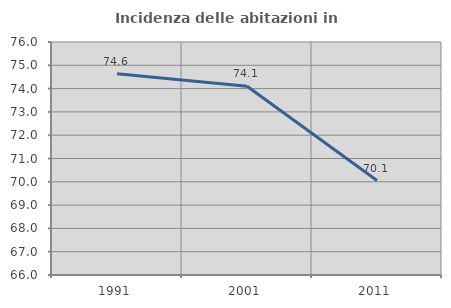
| Category | Incidenza delle abitazioni in proprietà  |
|---|---|
| 1991.0 | 74.639 |
| 2001.0 | 74.103 |
| 2011.0 | 70.053 |